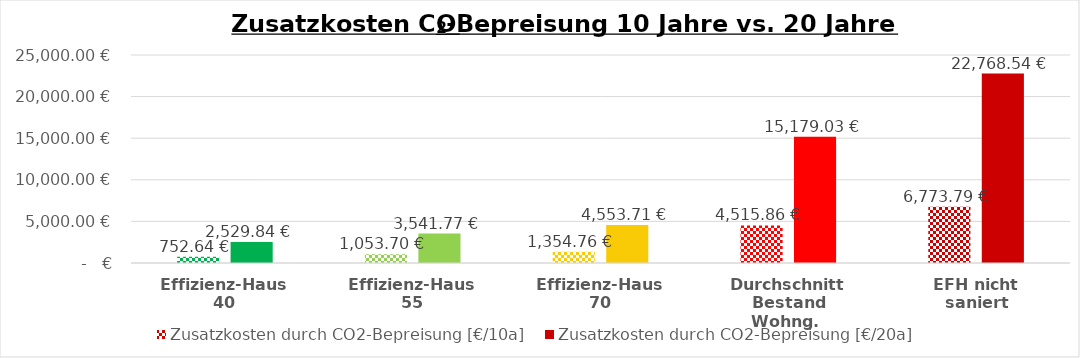
| Category | Zusatzkosten durch CO2-Bepreisung [€/10a]  | Zusatzkosten durch CO2-Bepreisung [€/20a] |
|---|---|---|
| Effizienz-Haus 40 | 752.643 | 2529.838 |
| Effizienz-Haus 55 | 1053.7 | 3541.773 |
| Effizienz-Haus 70 | 1354.757 | 4553.709 |
| Durchschnitt
Bestand Wohng.  | 4515.857 | 15179.029 |
| EFH nicht saniert | 6773.785 | 22768.544 |